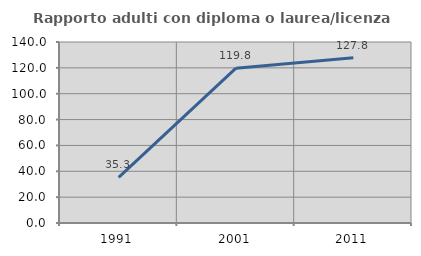
| Category | Rapporto adulti con diploma o laurea/licenza media  |
|---|---|
| 1991.0 | 35.345 |
| 2001.0 | 119.776 |
| 2011.0 | 127.755 |